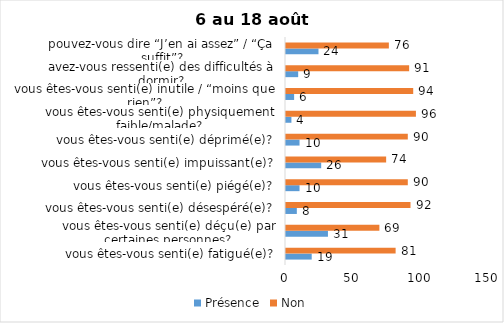
| Category | Présence | Non |
|---|---|---|
| vous êtes-vous senti(e) fatigué(e)? | 19 | 81 |
| vous êtes-vous senti(e) déçu(e) par certaines personnes? | 31 | 69 |
| vous êtes-vous senti(e) désespéré(e)? | 8 | 92 |
| vous êtes-vous senti(e) piégé(e)? | 10 | 90 |
| vous êtes-vous senti(e) impuissant(e)? | 26 | 74 |
| vous êtes-vous senti(e) déprimé(e)? | 10 | 90 |
| vous êtes-vous senti(e) physiquement faible/malade? | 4 | 96 |
| vous êtes-vous senti(e) inutile / “moins que rien”? | 6 | 94 |
| avez-vous ressenti(e) des difficultés à dormir? | 9 | 91 |
| pouvez-vous dire “J’en ai assez” / “Ça suffit”? | 24 | 76 |